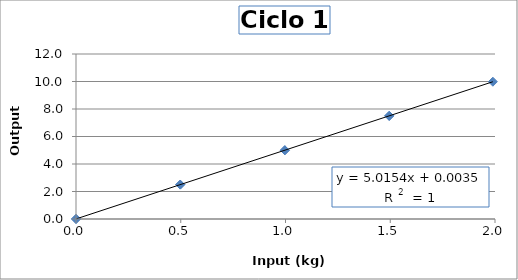
| Category | Ciclo 1 |
|---|---|
| 0.0 | 0 |
| 0.49760000000000004 | 2.503 |
| 0.9967999999999999 | 4.999 |
| 1.495 | 7.5 |
| 1.9898 | 9.985 |
| 1.495 | 7.5 |
| 0.9967999999999999 | 5.004 |
| 0.4976 | 2.502 |
| 0.0 | 0.004 |